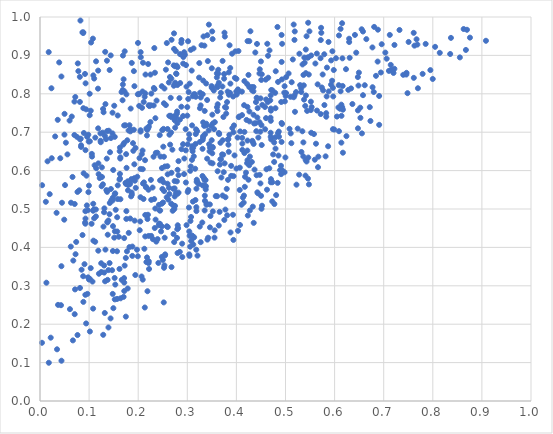
| Category | Series 0 |
|---|---|
| 0.2717757019257371 | 0.509 |
| 0.6163173114903269 | 0.82 |
| 0.2766274408369096 | 0.74 |
| 0.4349057238760965 | 0.818 |
| 0.4487115016646053 | 0.701 |
| 0.14375754651880324 | 0.215 |
| 0.44699737810574547 | 0.726 |
| 0.45155793424355195 | 0.667 |
| 0.3039513821085714 | 0.682 |
| 0.04978792153778344 | 0.694 |
| 0.28791492106920535 | 0.766 |
| 0.3515380195955413 | 0.942 |
| 0.18375936486341382 | 0.569 |
| 0.3557404852152999 | 0.444 |
| 0.46975025132680426 | 0.698 |
| 0.28027383550171103 | 0.602 |
| 0.361724342758873 | 0.598 |
| 0.27305038244145974 | 0.917 |
| 0.25242842534299814 | 0.636 |
| 0.5641087644352044 | 0.756 |
| 0.1665166699150309 | 0.315 |
| 0.46445196817225864 | 0.899 |
| 0.33725174062992047 | 0.575 |
| 0.3508265314064264 | 0.645 |
| 0.23590066496571638 | 0.646 |
| 0.4314470489495219 | 0.622 |
| 0.4112211675885632 | 0.806 |
| 0.36837507267958924 | 0.803 |
| 0.304437325159695 | 0.378 |
| 0.2741966061946681 | 0.554 |
| 0.06315692356234148 | 0.516 |
| 0.3119700741097272 | 0.659 |
| 0.6881939652716732 | 0.967 |
| 0.15202671336466833 | 0.32 |
| 0.07640141388395849 | 0.172 |
| 0.3514063166033048 | 0.662 |
| 0.17867019482913793 | 0.572 |
| 0.30401852805749063 | 0.382 |
| 0.18072443792067028 | 0.438 |
| 0.34726932483296125 | 0.621 |
| 0.3019317503041308 | 0.787 |
| 0.17545334362113663 | 0.643 |
| 0.5347020415484426 | 0.876 |
| 0.16610541499694587 | 0.805 |
| 0.3313700812120942 | 0.799 |
| 0.4789788526386254 | 0.802 |
| 0.33885826971033695 | 0.722 |
| 0.4000292185441169 | 0.605 |
| 0.7626498099116379 | 0.925 |
| 0.42264254565620274 | 0.627 |
| 0.2602153585224616 | 0.453 |
| 0.14438243268806406 | 0.552 |
| 0.20500303541546772 | 0.908 |
| 0.13047526627950468 | 0.492 |
| 0.3494496606575217 | 0.82 |
| 0.1475572456144637 | 0.697 |
| 0.09237468500909296 | 0.462 |
| 0.21432880068438565 | 0.801 |
| 0.09836642614933133 | 0.693 |
| 0.4748320401160949 | 0.642 |
| 0.2663546951852944 | 0.743 |
| 0.22673046169759348 | 0.801 |
| 0.6578125892953035 | 0.962 |
| 0.07811065106303228 | 0.859 |
| 0.5994683787668929 | 0.707 |
| 0.30996271739969494 | 0.657 |
| 0.27994373928043814 | 0.539 |
| 0.23501575356279414 | 0.736 |
| 0.03675503668357327 | 0.25 |
| 0.37922901776390616 | 0.748 |
| 0.2781476174317866 | 0.873 |
| 0.27418501544020235 | 0.573 |
| 0.279808059006891 | 0.823 |
| 0.19276680067264051 | 0.47 |
| 0.5223770925340805 | 0.563 |
| 0.7792949232177181 | 0.852 |
| 0.13676774038463335 | 0.545 |
| 0.10120332930983433 | 0.8 |
| 0.3893233242008164 | 0.586 |
| 0.18409094454609398 | 0.702 |
| 0.1059664209243466 | 0.637 |
| 0.4526550720620627 | 0.771 |
| 0.09659699031519042 | 0.279 |
| 0.3337677418724353 | 0.581 |
| 0.2204308394384722 | 0.711 |
| 0.10408187973876659 | 0.934 |
| 0.3809367611267923 | 0.778 |
| 0.1216883532756885 | 0.581 |
| 0.5879509458710412 | 0.806 |
| 0.11870144294665186 | 0.391 |
| 0.5372321164178953 | 0.822 |
| 0.26005280231179995 | 0.59 |
| 0.31396819730793213 | 0.426 |
| 0.1944658016771016 | 0.659 |
| 0.1623195719108116 | 0.651 |
| 0.4603186848094607 | 0.737 |
| 0.08793824444286336 | 0.325 |
| 0.4047679263525915 | 0.739 |
| 0.38216791910013037 | 0.806 |
| 0.49810175294160763 | 0.596 |
| 0.33570094610603773 | 0.535 |
| 0.6169593766535798 | 0.759 |
| 0.5524126134007727 | 0.699 |
| 0.379012764581928 | 0.764 |
| 0.15693049631529443 | 0.39 |
| 0.4929154690408768 | 0.721 |
| 0.37540857808751327 | 0.472 |
| 0.4148727611236894 | 0.517 |
| 0.12875917371404444 | 0.172 |
| 0.37683274732760996 | 0.765 |
| 0.25261066782936314 | 0.347 |
| 0.2514743557351943 | 0.709 |
| 0.35054854414854786 | 0.817 |
| 0.299917170065368 | 0.765 |
| 0.2750609557360204 | 0.872 |
| 0.4701455294027863 | 0.762 |
| 0.4041528728933378 | 0.911 |
| 0.7219158092320386 | 0.927 |
| 0.2636110631433377 | 0.694 |
| 0.2334349855345519 | 0.812 |
| 0.17601145314526967 | 0.799 |
| 0.7398179620690897 | 0.849 |
| 0.43984967230246763 | 0.778 |
| 0.019737645159443096 | 0.539 |
| 0.32610451422234743 | 0.803 |
| 0.33592428214409553 | 0.521 |
| 0.2967120209752442 | 0.708 |
| 0.4702846590607104 | 0.756 |
| 0.12342482815205646 | 0.678 |
| 0.12479465637008513 | 0.336 |
| 0.09233181793120515 | 0.277 |
| 0.5377582276165835 | 0.785 |
| 0.5457284100866701 | 0.579 |
| 0.2671780207323895 | 0.514 |
| 0.5012745415866612 | 0.843 |
| 0.5248521753570953 | 0.709 |
| 0.1377228103206164 | 0.315 |
| 0.44996944333320243 | 0.884 |
| 0.4154430115535842 | 0.535 |
| 0.09184586649155568 | 0.465 |
| 0.09288352869535665 | 0.827 |
| 0.13741669008083124 | 0.465 |
| 0.21891004298425698 | 0.474 |
| 0.6578572512431891 | 0.796 |
| 0.346162197592325 | 0.452 |
| 0.46291618686653824 | 0.93 |
| 0.6279400015442135 | 0.81 |
| 0.7060533243507475 | 0.891 |
| 0.07241750842828876 | 0.382 |
| 0.36018671031447336 | 0.843 |
| 0.23189055673417824 | 0.815 |
| 0.297358247653679 | 0.875 |
| 0.1932821551475058 | 0.574 |
| 0.3354291241869959 | 0.755 |
| 0.29837356258762604 | 0.819 |
| 0.043734931188755044 | 0.105 |
| 0.6028239517007516 | 0.893 |
| 0.25431427395942774 | 0.611 |
| 0.26754241639050846 | 0.739 |
| 0.4867212742728886 | 0.688 |
| 0.4262528436790034 | 0.817 |
| 0.26130423462977226 | 0.525 |
| 0.44263686729031027 | 0.738 |
| 0.8047257469071032 | 0.922 |
| 0.18298374201849066 | 0.564 |
| 0.33750752657081295 | 0.551 |
| 0.4735390840734486 | 0.809 |
| 0.3097367466031402 | 0.718 |
| 0.17941987068876486 | 0.563 |
| 0.10983670260760925 | 0.499 |
| 0.17632721891643965 | 0.607 |
| 0.1628418039864188 | 0.66 |
| 0.3969188943805386 | 0.842 |
| 0.5579403584647417 | 0.695 |
| 0.11890770485454438 | 0.619 |
| 0.43229881355731614 | 0.678 |
| 0.6805794740137217 | 0.974 |
| 0.07065185427663279 | 0.226 |
| 0.3846828755256735 | 0.798 |
| 0.14172310120244835 | 0.359 |
| 0.29369014465586285 | 0.908 |
| 0.13327744111055706 | 0.394 |
| 0.7613317779993891 | 0.842 |
| 0.5445053985705027 | 0.894 |
| 0.29190715237084386 | 0.896 |
| 0.23950242720718384 | 0.422 |
| 0.36072296201304677 | 0.533 |
| 0.42607403972975055 | 0.614 |
| 0.30703090091258056 | 0.914 |
| 0.24109165818595724 | 0.36 |
| 0.3313055227344611 | 0.68 |
| 0.37759026100100657 | 0.498 |
| 0.6797499255951558 | 0.805 |
| 0.45818138158033284 | 0.766 |
| 0.03612492340084461 | 0.732 |
| 0.48362431899650893 | 0.974 |
| 0.3378266449207028 | 0.56 |
| 0.6121745378783285 | 0.969 |
| 0.2675340688873731 | 0.84 |
| 0.2092158684933384 | 0.316 |
| 0.282070430085974 | 0.588 |
| 0.11810535216187068 | 0.813 |
| 0.33858576151839503 | 0.718 |
| 0.22172650346958678 | 0.715 |
| 0.0647180185736489 | 0.741 |
| 0.2729654567549954 | 0.957 |
| 0.4921270946771167 | 0.883 |
| 0.3742580645475221 | 0.596 |
| 0.20484928078989284 | 0.702 |
| 0.506332213310895 | 0.853 |
| 0.18944796712717205 | 0.671 |
| 0.09240809785071369 | 0.494 |
| 0.4117058132571958 | 0.685 |
| 0.08937049580308543 | 0.698 |
| 0.3979753855566708 | 0.91 |
| 0.23742849015804757 | 0.782 |
| 0.3612508747073857 | 0.821 |
| 0.48630154620665145 | 0.702 |
| 0.071865263292064 | 0.792 |
| 0.5654664164447504 | 0.825 |
| 0.5789419913309 | 0.903 |
| 0.2883113838846275 | 0.94 |
| 0.4469657781839833 | 0.853 |
| 0.030903045062690926 | 0.689 |
| 0.28397359626184737 | 0.789 |
| 0.3021090153422906 | 0.55 |
| 0.14941838414877906 | 0.242 |
| 0.5669145536859695 | 0.636 |
| 0.4163751354765267 | 0.701 |
| 0.11843243976713191 | 0.71 |
| 0.28502429006753427 | 0.733 |
| 0.13675732105707872 | 0.703 |
| 0.4733666426817805 | 0.57 |
| 0.6154555658162774 | 0.765 |
| 0.27879487919725765 | 0.572 |
| 0.22024829325195427 | 0.878 |
| 0.7217845541608096 | 0.865 |
| 0.1950426234120166 | 0.555 |
| 0.48467810064168215 | 0.697 |
| 0.6111199208645095 | 0.761 |
| 0.13058598435175672 | 0.353 |
| 0.32396680642893994 | 0.842 |
| 0.8673959586012564 | 0.914 |
| 0.4889949450447173 | 0.601 |
| 0.2594940302740464 | 0.611 |
| 0.41953683362948346 | 0.595 |
| 0.4224569116799749 | 0.766 |
| 0.5724660015344033 | 0.972 |
| 0.49751804075922257 | 0.803 |
| 0.2315021295212083 | 0.77 |
| 0.09168338278621091 | 0.852 |
| 0.191091935818963 | 0.706 |
| 0.6907473089438101 | 0.794 |
| 0.27975446432205775 | 0.723 |
| 0.14260222987111482 | 0.648 |
| 0.21121593114781245 | 0.779 |
| 0.10863322240609741 | 0.848 |
| 0.2878016693483315 | 0.933 |
| 0.4856778546514695 | 0.639 |
| 0.14520417674946484 | 0.523 |
| 0.5927529565495131 | 0.824 |
| 0.21081924247012396 | 0.526 |
| 0.5982881253874724 | 0.862 |
| 0.20469179466659793 | 0.531 |
| 0.43494658684926946 | 0.745 |
| 0.11390358088162833 | 0.481 |
| 0.3064371264498874 | 0.469 |
| 0.42633463127163873 | 0.937 |
| 0.26331587143838875 | 0.743 |
| 0.330916509890238 | 0.586 |
| 0.30387300571058373 | 0.694 |
| 0.1714771447960739 | 0.424 |
| 0.04935841866487445 | 0.472 |
| 0.4001220901680099 | 0.839 |
| 0.3395542511763773 | 0.514 |
| 0.16861709206274478 | 0.81 |
| 0.43695774429428913 | 0.603 |
| 0.21173004896275882 | 0.569 |
| 0.4981611979998045 | 0.82 |
| 0.3185814153486828 | 0.495 |
| 0.1713418619719016 | 0.718 |
| 0.5792439386511843 | 0.771 |
| 0.6140673899252079 | 0.743 |
| 0.32726410053958044 | 0.414 |
| 0.5390183574427593 | 0.881 |
| 0.25270963555807924 | 0.547 |
| 0.612243090282531 | 0.807 |
| 0.36834988577256067 | 0.63 |
| 0.39430043130106274 | 0.585 |
| 0.13216779170504545 | 0.69 |
| 0.5183588373183978 | 0.796 |
| 0.19230856591804846 | 0.82 |
| 0.4773496227299483 | 0.513 |
| 0.34992120633576673 | 0.866 |
| 0.6077322727273624 | 0.764 |
| 0.4606741496732413 | 0.785 |
| 0.12549465248146519 | 0.559 |
| 0.33538068912819086 | 0.561 |
| 0.5516612636696188 | 0.78 |
| 0.5406458017022876 | 0.587 |
| 0.08154592389478321 | 0.682 |
| 0.03469659112375356 | 0.135 |
| 0.10777436554052822 | 0.944 |
| 0.10557141367945766 | 0.644 |
| 0.2259015267718656 | 0.576 |
| 0.2898105321505261 | 0.375 |
| 0.5188529497388826 | 0.962 |
| 0.0823559812696848 | 0.991 |
| 0.4426965319771786 | 0.543 |
| 0.4162564943046614 | 0.646 |
| 0.21576365192113456 | 0.557 |
| 0.41320484765464705 | 0.53 |
| 0.6152812371346918 | 0.984 |
| 0.29141029272669083 | 0.742 |
| 0.2719621134695107 | 0.435 |
| 0.09538836867230926 | 0.509 |
| 0.34236999791662337 | 0.425 |
| 0.30605518326864223 | 0.599 |
| 0.597217190484395 | 0.793 |
| 0.10815800762016425 | 0.495 |
| 0.21488690620409567 | 0.85 |
| 0.4446758568601784 | 0.686 |
| 0.6084099528953019 | 0.822 |
| 0.1991989902368737 | 0.799 |
| 0.5103508570695131 | 0.792 |
| 0.2489723793653401 | 0.705 |
| 0.7159986628531794 | 0.861 |
| 0.6335423521412555 | 0.814 |
| 0.27285182674744124 | 0.508 |
| 0.8551256743964313 | 0.895 |
| 0.18042336573139806 | 0.705 |
| 0.8628741686679325 | 0.969 |
| 0.11845371066803223 | 0.86 |
| 0.5319320486070099 | 0.814 |
| 0.3310506939585729 | 0.657 |
| 0.4227204147964877 | 0.937 |
| 0.2740571995068629 | 0.734 |
| 0.1491074110531586 | 0.602 |
| 0.45164715820683254 | 0.851 |
| 0.7464856305200017 | 0.855 |
| 0.655137881851753 | 0.968 |
| 0.22090885271441507 | 0.55 |
| 0.3094985531025738 | 0.628 |
| 0.259771637076454 | 0.566 |
| 0.2678318851004803 | 0.349 |
| 0.3390729737308874 | 0.511 |
| 0.3731164086771773 | 0.641 |
| 0.4931118265954525 | 0.93 |
| 0.7485041914145308 | 0.802 |
| 0.34447286833496404 | 0.669 |
| 0.26694757514091705 | 0.699 |
| 0.10876985781746618 | 0.418 |
| 0.7143333946384803 | 0.875 |
| 0.14217241069138353 | 0.516 |
| 0.375012678399529 | 0.852 |
| 0.07007070773176949 | 0.693 |
| 0.20180437737978763 | 0.799 |
| 0.5661797367713588 | 0.609 |
| 0.24454869103807164 | 0.575 |
| 0.13078532223843897 | 0.334 |
| 0.10330463241381471 | 0.346 |
| 0.13737355315830624 | 0.467 |
| 0.32572585531633247 | 0.675 |
| 0.11238999920929127 | 0.415 |
| 0.3877543375363638 | 0.827 |
| 0.49203950854976386 | 0.724 |
| 0.6646339565447542 | 0.942 |
| 0.5428891522803362 | 0.95 |
| 0.17476815687145753 | 0.372 |
| 0.5948717108778047 | 0.834 |
| 0.2634930218982259 | 0.539 |
| 0.1748242889204774 | 0.22 |
| 0.31779533090047196 | 0.707 |
| 0.30400459595749263 | 0.442 |
| 0.519285855966379 | 0.753 |
| 0.4698504490110115 | 0.688 |
| 0.4920267748317829 | 0.953 |
| 0.22209271436374012 | 0.344 |
| 0.24820326393881664 | 0.375 |
| 0.21668849248978006 | 0.362 |
| 0.3208006809612065 | 0.57 |
| 0.5215041106497057 | 0.805 |
| 0.33687315020371367 | 0.557 |
| 0.17025960768661552 | 0.271 |
| 0.36578583101463225 | 0.493 |
| 0.3836020351868794 | 0.682 |
| 0.43607304497695565 | 0.723 |
| 0.11033274956045291 | 0.84 |
| 0.19212554498591417 | 0.616 |
| 0.14867351276974128 | 0.455 |
| 0.3714868408512292 | 0.819 |
| 0.21322145202757448 | 0.792 |
| 0.14771989364790394 | 0.751 |
| 0.09792652419845593 | 0.322 |
| 0.5965916703848864 | 0.815 |
| 0.3997480312089631 | 0.806 |
| 0.37606245294597207 | 0.619 |
| 0.4695000885121213 | 0.738 |
| 0.09980200477571843 | 0.316 |
| 0.4005832884004118 | 0.798 |
| 0.18469301711834174 | 0.762 |
| 0.07016110738403658 | 0.78 |
| 0.152265807379539 | 0.539 |
| 0.14016984466834315 | 0.704 |
| 0.17922279156410215 | 0.549 |
| 0.6137397624387776 | 0.772 |
| 0.3409656691037427 | 0.42 |
| 0.4175922585972367 | 0.584 |
| 0.5461280514139962 | 0.985 |
| 0.3843818969022563 | 0.649 |
| 0.4411123385678244 | 0.588 |
| 0.1740984262203572 | 0.568 |
| 0.49357333229474254 | 0.601 |
| 0.7854688572535974 | 0.93 |
| 0.35396537983840515 | 0.809 |
| 0.4709431423026217 | 0.681 |
| 0.27450179613031267 | 0.731 |
| 0.21394926966211447 | 0.627 |
| 0.5828711321015398 | 0.75 |
| 0.1866487196292984 | 0.543 |
| 0.12815935168801973 | 0.564 |
| 0.23545014297894973 | 0.472 |
| 0.2950740894463435 | 0.902 |
| 0.5868078240823218 | 0.663 |
| 0.2772970231798615 | 0.853 |
| 0.34611689897122877 | 0.66 |
| 0.30151895706035126 | 0.937 |
| 0.4809611894561818 | 0.536 |
| 0.13516821724373607 | 0.549 |
| 0.47100129995280227 | 0.81 |
| 0.6473862529487353 | 0.844 |
| 0.09264056428545397 | 0.475 |
| 0.33220163571621664 | 0.69 |
| 0.3670576312858088 | 0.79 |
| 0.3519586185638407 | 0.494 |
| 0.6486080920382531 | 0.821 |
| 0.24266438380824118 | 0.462 |
| 0.4225499137853017 | 0.678 |
| 0.14155451359078064 | 0.486 |
| 0.5638408089225149 | 0.905 |
| 0.18801339793308458 | 0.378 |
| 0.27526098616215644 | 0.712 |
| 0.49131569109949047 | 0.779 |
| 0.4700447757546862 | 0.73 |
| 0.34390859232487536 | 0.98 |
| 0.06029878007110345 | 0.73 |
| 0.16375464461523304 | 0.635 |
| 0.13193118002545512 | 0.229 |
| 0.22510974332966005 | 0.85 |
| 0.31908266433940136 | 0.571 |
| 0.5465639103343961 | 0.895 |
| 0.05589125539725315 | 0.642 |
| 0.2533782459696834 | 0.353 |
| 0.5729121896008754 | 0.959 |
| 0.2766433441180963 | 0.911 |
| 0.3289788575060264 | 0.926 |
| 0.13329884393084002 | 0.773 |
| 0.05002045607986938 | 0.748 |
| 0.2249682784974515 | 0.726 |
| 0.45108335994089743 | 0.501 |
| 0.2788290711036929 | 0.748 |
| 0.24420755802612248 | 0.461 |
| 0.22999910061689544 | 0.421 |
| 0.2820717188205675 | 0.625 |
| 0.3113983718439417 | 0.519 |
| 0.1604828033897453 | 0.428 |
| 0.7611198853778393 | 0.959 |
| 0.541581476896004 | 0.796 |
| 0.3172007522770003 | 0.695 |
| 0.2549209923881842 | 0.382 |
| 0.6773110740524946 | 0.817 |
| 0.12465289945176594 | 0.359 |
| 0.38563245381621636 | 0.693 |
| 0.09742171801204536 | 0.497 |
| 0.411515779905792 | 0.745 |
| 0.39166566185511376 | 0.711 |
| 0.1480795493771151 | 0.279 |
| 0.21603910014831618 | 0.557 |
| 0.4121451963790047 | 0.67 |
| 0.7199778924190096 | 0.854 |
| 0.6295752410846578 | 0.943 |
| 0.3353366098676871 | 0.496 |
| 0.28135071494025077 | 0.45 |
| 0.37497159173198424 | 0.839 |
| 0.277861326046542 | 0.852 |
| 0.3102241878811044 | 0.663 |
| 0.7696818476715492 | 0.814 |
| 0.10163181706095736 | 0.181 |
| 0.37189466166840934 | 0.886 |
| 0.2419717346835668 | 0.458 |
| 0.402443466509809 | 0.686 |
| 0.7153535943359707 | 0.862 |
| 0.22156819965708674 | 0.364 |
| 0.34592570950925694 | 0.512 |
| 0.3273608266996513 | 0.79 |
| 0.0863909418491845 | 0.96 |
| 0.2178158215893331 | 0.691 |
| 0.20418622963032917 | 0.467 |
| 0.4405518651644039 | 0.703 |
| 0.08802920185610885 | 0.958 |
| 0.46992683352990894 | 0.796 |
| 0.18705663849498377 | 0.537 |
| 0.08143712812098003 | 0.294 |
| 0.13927181697038193 | 0.341 |
| 0.677039148774966 | 0.921 |
| 0.7669303784685055 | 0.942 |
| 0.09062499805401569 | 0.356 |
| 0.4285460705366215 | 0.963 |
| 0.5477243007758553 | 0.564 |
| 0.30703838897984204 | 0.611 |
| 0.2790235097758911 | 0.425 |
| 0.30487823349970145 | 0.827 |
| 0.5166601396206154 | 0.98 |
| 0.5383742355903193 | 0.894 |
| 0.23260883131733123 | 0.526 |
| 0.17523792698965757 | 0.565 |
| 0.25113801791073176 | 0.662 |
| 0.5364149086024298 | 0.673 |
| 0.36425812741825014 | 0.829 |
| 0.4907573780455531 | 0.613 |
| 0.01794445981187398 | 0.1 |
| 0.532445936953747 | 0.648 |
| 0.4507035692419209 | 0.836 |
| 0.5474316670141465 | 0.85 |
| 0.5440090373481755 | 0.756 |
| 0.20530103987255377 | 0.895 |
| 0.5298016920696594 | 0.823 |
| 0.21435027143976393 | 0.429 |
| 0.7685898004490544 | 0.928 |
| 0.3497130462555301 | 0.679 |
| 0.1532118160839243 | 0.541 |
| 0.15422765937519356 | 0.498 |
| 0.300000442681848 | 0.743 |
| 0.30080922183419667 | 0.544 |
| 0.4998090329194188 | 0.634 |
| 0.03374337711215669 | 0.49 |
| 0.21253978685300878 | 0.396 |
| 0.08817561443984334 | 0.96 |
| 0.5321224708898172 | 0.805 |
| 0.11375831937013337 | 0.499 |
| 0.05271545088718321 | 0.673 |
| 0.6169290259659032 | 0.647 |
| 0.23124994985066094 | 0.636 |
| 0.5105706171790821 | 0.697 |
| 0.3803173555937256 | 0.552 |
| 0.10690824996838844 | 0.311 |
| 0.9082570874674036 | 0.938 |
| 0.4218112136617922 | 0.619 |
| 0.16289544094438602 | 0.58 |
| 0.09968286046471553 | 0.561 |
| 0.49266000318706804 | 0.837 |
| 0.350691452269132 | 0.962 |
| 0.234845041058529 | 0.501 |
| 0.7124133568320277 | 0.953 |
| 0.1837275939650288 | 0.475 |
| 0.20469885218357942 | 0.604 |
| 0.5532864900461061 | 0.765 |
| 0.29342158435084353 | 0.591 |
| 0.42746001183063964 | 0.636 |
| 0.3435184466548207 | 0.705 |
| 0.18220667519105138 | 0.401 |
| 0.6716788125885991 | 0.765 |
| 0.562097455898759 | 0.67 |
| 0.37204060368647884 | 0.679 |
| 0.6440567338630538 | 0.907 |
| 0.6942240746882887 | 0.855 |
| 0.5523460244594469 | 0.9 |
| 0.12764738557169164 | 0.699 |
| 0.288203295611021 | 0.656 |
| 0.5844233397872901 | 0.868 |
| 0.15335235285377669 | 0.303 |
| 0.527859251510722 | 0.589 |
| 0.6556565892388476 | 0.697 |
| 0.42456478622321725 | 0.576 |
| 0.5816872253019034 | 0.637 |
| 0.04360042174979262 | 0.351 |
| 0.15225736753140062 | 0.688 |
| 0.6959431784377242 | 0.929 |
| 0.43515062419024486 | 0.669 |
| 0.4796698374421491 | 0.657 |
| 0.5965354150627848 | 0.708 |
| 0.7507472111859201 | 0.935 |
| 0.25634149090451785 | 0.771 |
| 0.192036691178345 | 0.58 |
| 0.661436306892017 | 0.822 |
| 0.0846933252222204 | 0.342 |
| 0.27360096747988427 | 0.5 |
| 0.10338563524402411 | 0.756 |
| 0.21979755869164486 | 0.485 |
| 0.40699169366948285 | 0.608 |
| 0.5413057056307201 | 0.915 |
| 0.17239726328090144 | 0.353 |
| 0.08829198316129794 | 0.763 |
| 0.31732743408562514 | 0.792 |
| 0.6240900902078403 | 0.69 |
| 0.26090261953988225 | 0.882 |
| 0.30476016154975016 | 0.43 |
| 0.08891288839000755 | 0.593 |
| 0.011885836429324281 | 0.519 |
| 0.3311375830594111 | 0.562 |
| 0.003992006942207471 | 0.152 |
| 0.14684367672852505 | 0.341 |
| 0.5081885628080809 | 0.709 |
| 0.3735467992259036 | 0.74 |
| 0.2939728050257755 | 0.631 |
| 0.15120857058298443 | 0.769 |
| 0.06271529202195003 | 0.402 |
| 0.38607539409497293 | 0.926 |
| 0.2702368704702024 | 0.495 |
| 0.14402711270107915 | 0.9 |
| 0.36041303111221723 | 0.765 |
| 0.12002651410953113 | 0.331 |
| 0.5739890022509102 | 0.816 |
| 0.04475576604280396 | 0.516 |
| 0.15248349650590276 | 0.442 |
| 0.18231395419464902 | 0.718 |
| 0.06781111686175212 | 0.366 |
| 0.5597113545160938 | 0.628 |
| 0.37191212550798525 | 0.535 |
| 0.1882217373475915 | 0.402 |
| 0.4346325143020927 | 0.807 |
| 0.4439739006592772 | 0.541 |
| 0.17124909700786695 | 0.32 |
| 0.467457104611095 | 0.913 |
| 0.4073170913396692 | 0.458 |
| 0.18690198596489538 | 0.88 |
| 0.25395681773896583 | 0.425 |
| 0.19753446030829902 | 0.394 |
| 0.023277013710432115 | 0.814 |
| 0.5954833023242208 | 0.911 |
| 0.3453516504866766 | 0.65 |
| 0.3940027057908929 | 0.7 |
| 0.2795603965813038 | 0.447 |
| 0.1325708174913527 | 0.312 |
| 0.49199858672494423 | 0.675 |
| 0.491111760583669 | 0.591 |
| 0.20307099592240874 | 0.445 |
| 0.16815657191364075 | 0.783 |
| 0.39301539567199695 | 0.485 |
| 0.17857129469609268 | 0.293 |
| 0.2582538534464499 | 0.932 |
| 0.20969633429278667 | 0.881 |
| 0.5429166043872308 | 0.624 |
| 0.19811693643134765 | 0.584 |
| 0.3168499919885839 | 0.669 |
| 0.12952987604862098 | 0.752 |
| 0.5401766589962799 | 0.768 |
| 0.2478820882247924 | 0.514 |
| 0.4840334216275973 | 0.568 |
| 0.11448263296287298 | 0.606 |
| 0.43851080878237525 | 0.908 |
| 0.13633513409974785 | 0.886 |
| 0.3612696452342099 | 0.817 |
| 0.04276250232936807 | 0.249 |
| 0.09466022303175481 | 0.587 |
| 0.703320293132983 | 0.907 |
| 0.5766031288258312 | 0.809 |
| 0.44920062625741297 | 0.788 |
| 0.44264022447913043 | 0.788 |
| 0.3343105541441047 | 0.717 |
| 0.32721505006303986 | 0.77 |
| 0.07373083729471142 | 0.414 |
| 0.31931097680649256 | 0.576 |
| 0.38371361831174655 | 0.667 |
| 0.29695679604443503 | 0.653 |
| 0.16349624818143516 | 0.631 |
| 0.6475419805351323 | 0.757 |
| 0.1641533684288633 | 0.267 |
| 0.06624035063084288 | 0.583 |
| 0.16188826940827117 | 0.344 |
| 0.2855100465077537 | 0.828 |
| 0.5283108759483438 | 0.904 |
| 0.4265827795940781 | 0.728 |
| 0.13281735023474617 | 0.909 |
| 0.36133892208898577 | 0.755 |
| 0.26776696250595433 | 0.594 |
| 0.4701751168935172 | 0.57 |
| 0.5168083785344052 | 0.791 |
| 0.3111391972532018 | 0.794 |
| 0.7998778789130266 | 0.839 |
| 0.24827133135475232 | 0.455 |
| 0.0763426662484672 | 0.544 |
| 0.3201321615743046 | 0.703 |
| 0.5757111965273612 | 0.85 |
| 0.34042218675146496 | 0.784 |
| 0.280179502986567 | 0.385 |
| 0.013055576077623865 | 0.308 |
| 0.17165166650605967 | 0.286 |
| 0.452173275337742 | 0.509 |
| 0.6307053917477816 | 0.894 |
| 0.0769617006467136 | 0.879 |
| 0.24543135622040846 | 0.637 |
| 0.5362874198057321 | 0.637 |
| 0.1861248346110106 | 0.578 |
| 0.1141847978615187 | 0.885 |
| 0.5608359316453027 | 0.879 |
| 0.45023476974703935 | 0.534 |
| 0.09857488342347165 | 0.544 |
| 0.6296817886591222 | 0.935 |
| 0.17205053489926614 | 0.806 |
| 0.16278049040481213 | 0.591 |
| 0.30331762865354794 | 0.504 |
| 0.795057015563348 | 0.862 |
| 0.15229520430980792 | 0.265 |
| 0.20784890247837806 | 0.763 |
| 0.3349276621742403 | 0.576 |
| 0.43342622724355473 | 0.506 |
| 0.4585443375962319 | 0.708 |
| 0.6088694110212557 | 0.952 |
| 0.19412004606944233 | 0.328 |
| 0.46891163711930606 | 0.783 |
| 0.412099001616549 | 0.654 |
| 0.5011796544826634 | 0.802 |
| 0.5365941697542844 | 0.849 |
| 0.1344765274919082 | 0.682 |
| 0.5929750861776659 | 0.887 |
| 0.39334672467943765 | 0.793 |
| 0.43070244604303143 | 0.818 |
| 0.376512801847542 | 0.949 |
| 0.36409794686578223 | 0.457 |
| 0.1573678661029635 | 0.441 |
| 0.07998074746297679 | 0.549 |
| 0.199246787237086 | 0.377 |
| 0.10122060881332495 | 0.744 |
| 0.21849433632316528 | 0.706 |
| 0.3323287264057053 | 0.726 |
| 0.32307400026815336 | 0.565 |
| 0.29709950935888385 | 0.569 |
| 0.04130081334245095 | 0.632 |
| 0.41711476976573525 | 0.558 |
| 0.12308615253238686 | 0.697 |
| 0.6525759930610487 | 0.737 |
| 0.2894973348024422 | 0.41 |
| 0.4265431325681982 | 0.754 |
| 0.20887497760505658 | 0.652 |
| 0.382885070572917 | 0.576 |
| 0.5718814502675916 | 0.94 |
| 0.3619208426104086 | 0.773 |
| 0.09267604245358252 | 0.653 |
| 0.5343325528672613 | 0.702 |
| 0.17582119430140053 | 0.474 |
| 0.34858529032687746 | 0.716 |
| 0.3185906209721734 | 0.553 |
| 0.16944192455976625 | 0.668 |
| 0.10820976553528605 | 0.241 |
| 0.28010304164474664 | 0.869 |
| 0.24338736688887774 | 0.496 |
| 0.3165998714695827 | 0.523 |
| 0.4489732444301404 | 0.567 |
| 0.44197115568244905 | 0.93 |
| 0.3107562288016247 | 0.65 |
| 0.8369672797365144 | 0.946 |
| 0.28470902377217666 | 0.388 |
| 0.37572665539470196 | 0.959 |
| 0.22279225131735647 | 0.768 |
| 0.11123197623809644 | 0.614 |
| 0.1855783613383991 | 0.533 |
| 0.3347902566692288 | 0.925 |
| 0.6414439041534344 | 0.953 |
| 0.2749281178597651 | 0.508 |
| 0.4041072882277881 | 0.806 |
| 0.2792503316884041 | 0.754 |
| 0.1637763191944307 | 0.525 |
| 0.25239591739582334 | 0.775 |
| 0.3257139737830981 | 0.763 |
| 0.46702553642345424 | 0.606 |
| 0.3408410770081962 | 0.953 |
| 0.27713801223524825 | 0.542 |
| 0.3305686942785806 | 0.465 |
| 0.3497978247694258 | 0.816 |
| 0.39118500521208854 | 0.904 |
| 0.2501974630024988 | 0.367 |
| 0.29847514175291734 | 0.458 |
| 0.5125842946363567 | 0.83 |
| 0.1569968968967168 | 0.266 |
| 0.33607285520155683 | 0.695 |
| 0.36304231004130716 | 0.863 |
| 0.08295724815649053 | 0.683 |
| 0.33306085236178806 | 0.949 |
| 0.4730182450301399 | 0.52 |
| 0.44762451283600224 | 0.864 |
| 0.6907975212530156 | 0.719 |
| 0.2483595377197988 | 0.607 |
| 0.5714429702581492 | 0.893 |
| 0.1311247782111885 | 0.502 |
| 0.21677136245706474 | 0.71 |
| 0.14185656667932978 | 0.862 |
| 0.3244367013326952 | 0.88 |
| 0.15831781785941856 | 0.526 |
| 0.35141090620583515 | 0.619 |
| 0.3674623998174903 | 0.672 |
| 0.24815753377006633 | 0.577 |
| 0.20684682995905423 | 0.324 |
| 0.22143030764254024 | 0.43 |
| 0.2390913874762315 | 0.647 |
| 0.03912504173113762 | 0.882 |
| 0.30896209383707274 | 0.86 |
| 0.40302710279126897 | 0.811 |
| 0.24656240813862262 | 0.442 |
| 0.21438423917526106 | 0.484 |
| 0.264727949658929 | 0.844 |
| 0.5003353835810596 | 0.794 |
| 0.3869625198368054 | 0.802 |
| 0.12373095773590226 | 0.674 |
| 0.08366727623214987 | 0.662 |
| 0.36021288760825376 | 0.853 |
| 0.41630770295175357 | 0.833 |
| 0.4391591081827494 | 0.723 |
| 0.18373287315970388 | 0.707 |
| 0.31094965795699536 | 0.424 |
| 0.015379301379585986 | 0.624 |
| 0.3182587225169803 | 0.394 |
| 0.673019420730023 | 0.729 |
| 0.31220373610980756 | 0.407 |
| 0.3319921188213566 | 0.685 |
| 0.42748595000045986 | 0.496 |
| 0.14813286210195087 | 0.529 |
| 0.3939148391817858 | 0.419 |
| 0.35448000456550777 | 0.708 |
| 0.35192886046207195 | 0.723 |
| 0.12848313750362406 | 0.76 |
| 0.6876826530119039 | 0.884 |
| 0.08373564043444504 | 0.666 |
| 0.2179486603776425 | 0.374 |
| 0.5838363227760563 | 0.793 |
| 0.36286389657524787 | 0.852 |
| 0.39502559394029624 | 0.718 |
| 0.20267808663831344 | 0.632 |
| 0.6089186592693296 | 0.703 |
| 0.4793077974714801 | 0.687 |
| 0.5876149783643616 | 0.935 |
| 0.551612499828836 | 0.758 |
| 0.8695864092296686 | 0.967 |
| 0.09399394455726506 | 0.759 |
| 0.10507541398995524 | 0.462 |
| 0.2188999954849995 | 0.286 |
| 0.4076807581713966 | 0.702 |
| 0.2583576855822295 | 0.455 |
| 0.4612093619826446 | 0.603 |
| 0.4104127009376274 | 0.511 |
| 0.459763419745446 | 0.837 |
| 0.3027505867611294 | 0.805 |
| 0.3811505591126406 | 0.484 |
| 0.35540742975292494 | 0.425 |
| 0.1703117031028175 | 0.838 |
| 0.05098964368536818 | 0.562 |
| 0.6522534876888443 | 0.764 |
| 0.5148733427400328 | 0.889 |
| 0.17590292064764657 | 0.494 |
| 0.16892850314626784 | 0.9 |
| 0.2679394060703204 | 0.941 |
| 0.5182663732742349 | 0.94 |
| 0.15831267540383565 | 0.744 |
| 0.22653462903597588 | 0.524 |
| 0.30577636332425906 | 0.402 |
| 0.3509905956623882 | 0.746 |
| 0.34720880468430093 | 0.482 |
| 0.5487603177117096 | 0.963 |
| 0.11261189474671873 | 0.686 |
| 0.3079180468373337 | 0.417 |
| 0.2742993809598403 | 0.533 |
| 0.2515521252027706 | 0.57 |
| 0.4060814398802275 | 0.741 |
| 0.2422574351839002 | 0.511 |
| 0.6362536729990433 | 0.773 |
| 0.28212723300997045 | 0.543 |
| 0.6159352845287015 | 0.892 |
| 0.4245837402328094 | 0.849 |
| 0.09595659992242311 | 0.688 |
| 0.44121060493438813 | 0.79 |
| 0.2624279558178334 | 0.829 |
| 0.1715811913661074 | 0.672 |
| 0.06700630552455145 | 0.158 |
| 0.7105966581807006 | 0.86 |
| 0.15717730900271876 | 0.479 |
| 0.2213871889335114 | 0.77 |
| 0.08124251095548574 | 0.779 |
| 0.4475908341895717 | 0.589 |
| 0.22112479059287848 | 0.359 |
| 0.6475698854099889 | 0.71 |
| 0.13796097795342932 | 0.433 |
| 0.2913370520820361 | 0.669 |
| 0.5410628609459049 | 0.628 |
| 0.2438799476802549 | 0.692 |
| 0.2492217176310264 | 0.552 |
| 0.4068042682491203 | 0.55 |
| 0.08832603543350837 | 0.258 |
| 0.09397481472058833 | 0.202 |
| 0.07521283142135993 | 0.688 |
| 0.43323937868689055 | 0.675 |
| 0.46228231457123103 | 0.55 |
| 0.13942363383984357 | 0.192 |
| 0.32074253787853424 | 0.379 |
| 0.5830061661993324 | 0.74 |
| 0.1687563689332232 | 0.824 |
| 0.4232718769242979 | 0.483 |
| 0.27525965229240457 | 0.829 |
| 0.2048853668151719 | 0.705 |
| 0.2695974598570936 | 0.655 |
| 0.2255155272176318 | 0.77 |
| 0.4207291507453982 | 0.732 |
| 0.29160024796798334 | 0.879 |
| 0.3674119789776419 | 0.629 |
| 0.017725344472568905 | 0.909 |
| 0.2627377599325893 | 0.555 |
| 0.4647959206378689 | 0.842 |
| 0.4769251648663897 | 0.623 |
| 0.23285200978172282 | 0.919 |
| 0.10156370897951017 | 0.318 |
| 0.3152873796721316 | 0.799 |
| 0.2480542649156422 | 0.82 |
| 0.3184317497047795 | 0.505 |
| 0.2852265414629873 | 0.903 |
| 0.40326107208063344 | 0.443 |
| 0.351852570275101 | 0.66 |
| 0.07064783546713949 | 0.513 |
| 0.2733068474626691 | 0.741 |
| 0.5414051595980551 | 0.854 |
| 0.19952621880878352 | 0.932 |
| 0.1484233568887544 | 0.391 |
| 0.3130017365414478 | 0.798 |
| 0.4795985840282069 | 0.762 |
| 0.19116802400835464 | 0.859 |
| 0.27231812909673736 | 0.874 |
| 0.2546475379898362 | 0.379 |
| 0.11940536661808288 | 0.591 |
| 0.2507625652442894 | 0.517 |
| 0.3127158153612605 | 0.918 |
| 0.061003583880564816 | 0.239 |
| 0.4319867407187965 | 0.809 |
| 0.48480367163047977 | 0.831 |
| 0.4801371877732483 | 0.859 |
| 0.17404308469615082 | 0.718 |
| 0.6231905956827448 | 0.864 |
| 0.3874440833663655 | 0.867 |
| 0.364973098972744 | 0.695 |
| 0.4219328815643685 | 0.825 |
| 0.35606831795101745 | 0.726 |
| 0.25202942276954565 | 0.257 |
| 0.4157151922406158 | 0.77 |
| 0.37777737632669184 | 0.531 |
| 0.36938769100045754 | 0.582 |
| 0.14439526335306851 | 0.685 |
| 0.09916688181510913 | 0.676 |
| 0.02183547727799673 | 0.165 |
| 0.20930361008405463 | 0.604 |
| 0.31320209807243327 | 0.637 |
| 0.5464249802261121 | 0.634 |
| 0.6137615512242515 | 0.673 |
| 0.6842958483070798 | 0.847 |
| 0.4986973819609758 | 0.78 |
| 0.004288743238190951 | 0.562 |
| 0.2804913870636987 | 0.458 |
| 0.11029094077489043 | 0.476 |
| 0.023876455169434596 | 0.632 |
| 0.17779080129759917 | 0.679 |
| 0.8354104842842287 | 0.904 |
| 0.3845383058646835 | 0.856 |
| 0.21341524124625466 | 0.243 |
| 0.17248205361079316 | 0.911 |
| 0.16194512803202898 | 0.577 |
| 0.38267362883381584 | 0.681 |
| 0.1293049075122532 | 0.454 |
| 0.300897629603165 | 0.669 |
| 0.24476536411627114 | 0.496 |
| 0.8756883623752004 | 0.946 |
| 0.10838962370260563 | 0.514 |
| 0.8142107096753859 | 0.907 |
| 0.2598022397213494 | 0.708 |
| 0.7321773240256148 | 0.966 |
| 0.44324324477673416 | 0.763 |
| 0.5119176641747647 | 0.671 |
| 0.043593440266978534 | 0.845 |
| 0.27151640548827116 | 0.553 |
| 0.25349929982524777 | 0.814 |
| 0.10154563243546688 | 0.676 |
| 0.42231875916476425 | 0.652 |
| 0.45105262245092814 | 0.718 |
| 0.2650356809048945 | 0.668 |
| 0.20977801493217374 | 0.566 |
| 0.34185069877987406 | 0.885 |
| 0.33837434177526726 | 0.827 |
| 0.20879891144013063 | 0.806 |
| 0.12603608736951855 | 0.609 |
| 0.14780647955511306 | 0.522 |
| 0.3708788181904027 | 0.642 |
| 0.3404471370909665 | 0.631 |
| 0.3160664189663549 | 0.605 |
| 0.3642743717024638 | 0.698 |
| 0.46385093383936404 | 0.778 |
| 0.20728399885140292 | 0.643 |
| 0.17161189920309616 | 0.308 |
| 0.08657967793123211 | 0.432 |
| 0.2732723902512444 | 0.414 |
| 0.0713601683363364 | 0.291 |
| 0.36629643679359825 | 0.616 |
| 0.3076543511806634 | 0.479 |
| 0.15836846911880498 | 0.562 |
| 0.6048113491139602 | 0.741 |
| 0.17711855258716536 | 0.39 |
| 0.35797644920693206 | 0.534 |
| 0.22653476514840842 | 0.43 |
| 0.5717421820133816 | 0.747 |
| 0.23683989019181606 | 0.415 |
| 0.0811465677110712 | 0.844 |
| 0.12621984420865295 | 0.583 |
| 0.2563839826716918 | 0.863 |
| 0.47041219401058265 | 0.578 |
| 0.13929284747706705 | 0.47 |
| 0.3892910231084593 | 0.612 |
| 0.3880767350287767 | 0.439 |
| 0.23406603504743118 | 0.855 |
| 0.20206289949490575 | 0.769 |
| 0.6494674004099747 | 0.855 |
| 0.19006180658609917 | 0.651 |
| 0.3962088646864673 | 0.64 |
| 0.4768908871261146 | 0.673 |
| 0.2580510171931486 | 0.531 |
| 0.22928564409658225 | 0.556 |
| 0.26621949604398853 | 0.79 |
| 0.3097951402727134 | 0.431 |
| 0.23376376922417696 | 0.45 |
| 0.33239671671239657 | 0.834 |
| 0.7461152552059038 | 0.85 |
| 0.4352779730805175 | 0.464 |
| 0.15120749998910865 | 0.425 |
| 0.32537752709961343 | 0.454 |
| 0.13598125993290777 | 0.631 |
| 0.27249621616896325 | 0.821 |